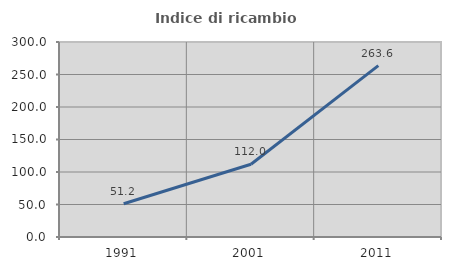
| Category | Indice di ricambio occupazionale  |
|---|---|
| 1991.0 | 51.163 |
| 2001.0 | 112 |
| 2011.0 | 263.636 |